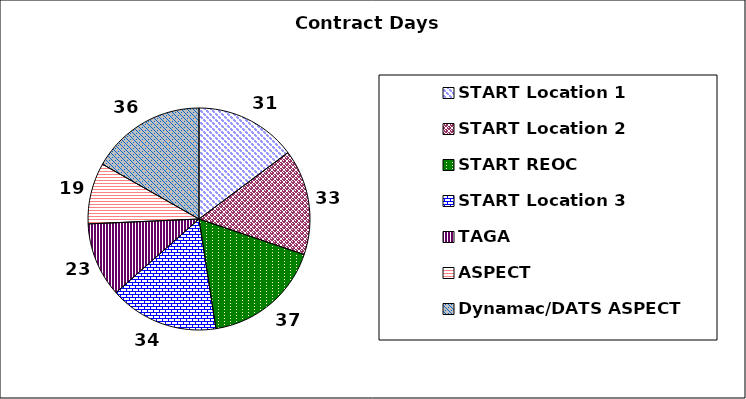
| Category | Series 0 |
|---|---|
| START Location 1 | 31.34 |
| START Location 2 | 32.622 |
| START REOC  | 36.8 |
| START Location 3 | 33.667 |
| TAGA  | 22.978 |
| ASPECT | 18.914 |
| Dynamac/DATS ASPECT | 35.555 |